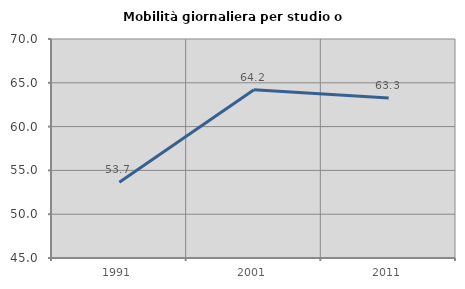
| Category | Mobilità giornaliera per studio o lavoro |
|---|---|
| 1991.0 | 53.657 |
| 2001.0 | 64.196 |
| 2011.0 | 63.265 |